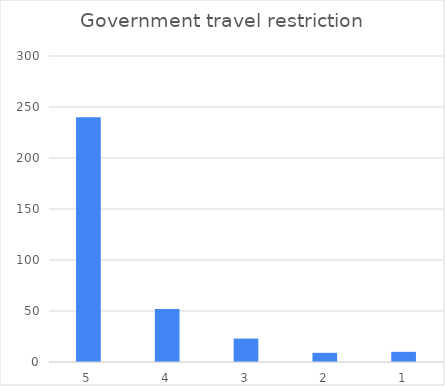
| Category | Series 0 |
|---|---|
| 5 | 240 |
| 4 | 52 |
| 3 | 23 |
| 2 | 9 |
| 1 | 10 |